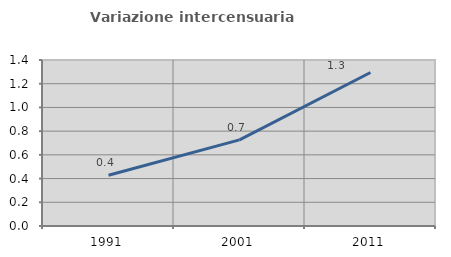
| Category | Variazione intercensuaria annua |
|---|---|
| 1991.0 | 0.428 |
| 2001.0 | 0.726 |
| 2011.0 | 1.295 |